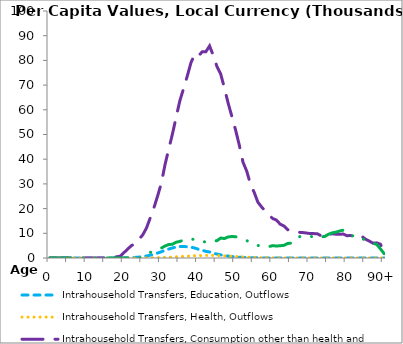
| Category | Intrahousehold Transfers, Education, Outflows | Intrahousehold Transfers, Health, Outflows | Intrahousehold Transfers, Consumption other than health and education, Outflows | Intrahousehold Transfers, Saving, Outflows |
|---|---|---|---|---|
| 0 | 0 | 0 | 0 | 0 |
|  | 0 | 0 | 0 | 0 |
| 2 | 0 | 0 | 0 | 0 |
| 3 | 0 | 0 | 0 | 0 |
| 4 | 0 | 0 | 0 | 0 |
| 5 | 0 | 0 | 0 | 0 |
| 6 | 0 | 0 | 0 | 0 |
| 7 | 0 | 0 | 0 | 0 |
| 8 | 0 | 0 | 0 | 0 |
| 9 | 0 | 0 | 0 | 0 |
| 10 | 0 | 0 | 0 | 0 |
| 11 | 0 | 0 | 0 | 0 |
| 12 | 0 | 0 | 0 | 0 |
| 13 | 0 | 0 | 0 | 0 |
| 14 | 0 | 0 | 0 | 0 |
| 15 | 0 | 0 | 0 | 0 |
| 16 | 0.366 | 0.346 | 65.875 | 0 |
| 17 | 6.569 | 1.67 | 259.832 | 0 |
| 18 | 16.383 | 2.833 | 487.914 | 0 |
| 19 | 10.416 | 3.796 | 756.479 | 0 |
| 20 | 53.145 | 10.644 | 2243.405 | 0 |
| 21 | 91.967 | 17.326 | 3692.64 | 0 |
| 22 | 187.087 | 24.302 | 5065.788 | 0 |
| 23 | 238.739 | 27.246 | 5686.196 | 0 |
| 24 | 365.379 | 36.657 | 7562.358 | 0 |
| 25 | 584.322 | 46.714 | 9346.852 | 507.666 |
| 26 | 801.056 | 62.32 | 12085.561 | 1449.732 |
| 27 | 1127.487 | 87.22 | 16141.627 | 2217.397 |
| 28 | 1541.35 | 110.231 | 20249.531 | 2931.239 |
| 29 | 2003.561 | 143.755 | 25043.103 | 3488.56 |
| 30 | 2507.913 | 181.924 | 30248.898 | 4017.642 |
| 31 | 3137.544 | 245.717 | 37759.934 | 4841.376 |
| 32 | 3620.924 | 311.477 | 44117.902 | 5451.933 |
| 33 | 4058.238 | 383.403 | 50166.623 | 5551.679 |
| 34 | 4449.046 | 469.305 | 57030.074 | 6405.236 |
| 35 | 4667.877 | 566.917 | 63673.084 | 6706.28 |
| 36 | 4631.108 | 651.606 | 68607.813 | 7281.457 |
| 37 | 4579.524 | 741.71 | 73681.284 | 7440.938 |
| 38 | 4353.614 | 845.51 | 79129.506 | 7800.765 |
| 39 | 4053.271 | 919.183 | 82488.673 | 7366.827 |
| 40 | 3511.164 | 953.761 | 81785.344 | 7367.397 |
| 41 | 3179.889 | 999.05 | 83469.096 | 6816.54 |
| 42 | 2673.718 | 1033.682 | 83512.781 | 6385.486 |
| 43 | 2440.687 | 1075.184 | 85860.055 | 6954.928 |
| 44 | 1944.502 | 1041.103 | 81952.507 | 6815.225 |
| 45 | 1583.984 | 990.184 | 77505.603 | 7032.1 |
| 46 | 1269.404 | 946.455 | 74450.504 | 8074.179 |
| 47 | 1002.368 | 867.843 | 68824.247 | 7875.927 |
| 48 | 791.258 | 777.506 | 62701.401 | 8529.473 |
| 49 | 579.719 | 693.53 | 57331.966 | 8686.921 |
| 50 | 438.14 | 610.627 | 51850.757 | 8616.211 |
| 51 | 322.562 | 511.363 | 45724.036 | 8196.906 |
| 52 | 222.982 | 409.46 | 38777.865 | 7596.645 |
| 53 | 167.153 | 342.682 | 35169.73 | 7036.466 |
| 54 | 114.312 | 264.196 | 29966.779 | 6344.574 |
| 55 | 88.1 | 210.73 | 26612.277 | 5826.137 |
| 56 | 62.167 | 159.025 | 22606.396 | 5120.941 |
| 57 | 42.625 | 126.559 | 20666.155 | 4623.427 |
| 58 | 42.046 | 98.043 | 18950.333 | 4370.855 |
| 59 | 31.418 | 75.033 | 17410.603 | 4621.211 |
| 60 | 21.006 | 58.377 | 15968.748 | 5007.75 |
| 61 | 23.753 | 47.922 | 15359.784 | 4854.06 |
| 62 | 14.141 | 36.35 | 13717.926 | 4966.854 |
| 63 | 14.356 | 26.343 | 12975.549 | 5122.813 |
| 64 | 10.79 | 17.797 | 11469.189 | 5873.644 |
| 65 | 6.197 | 12.247 | 11392.994 | 6030.873 |
| 66 | 7.812 | 13.247 | 10891.171 | 7446.895 |
| 67 | 5.656 | 10.855 | 10404.975 | 8795.833 |
| 68 | 4.057 | 8.027 | 10328.071 | 8288.632 |
| 69 | 2.252 | 5.344 | 10127.326 | 8356.417 |
| 70 | 1.478 | 5.562 | 9901.597 | 8570.653 |
| 71 | 0.88 | 5.185 | 9880.906 | 8793.036 |
| 72 | 2.073 | 3.264 | 9824.847 | 8102.786 |
| 73 | 0.174 | 1.475 | 9015.188 | 8572.81 |
| 74 | 0.07 | 2.949 | 9841.91 | 8717.952 |
| 75 | 0.29 | 0.581 | 9358.488 | 9592.716 |
| 76 | 0.165 | 0.633 | 9811.262 | 10165.385 |
| 77 | 0.2 | 0.837 | 9638.207 | 10458.416 |
| 78 | 0.347 | 1.534 | 9624.992 | 10923.296 |
| 79 | 0.087 | 1.274 | 9686.056 | 11262.753 |
| 80 | 0.491 | 1.452 | 9024.707 | 10606.337 |
| 81 | 0.002 | 0.369 | 9107.197 | 8980.496 |
| 82 | 0.005 | 0.264 | 8659.799 | 8956.547 |
| 83 | 0.001 | 0.132 | 8136.045 | 9120.636 |
| 84 | 0 | 0 | 8741.372 | 8030.443 |
| 85 | 0.003 | 0.233 | 7625.696 | 7043.986 |
| 86 | 0.005 | 0.283 | 6846.435 | 6702.674 |
| 87 | 0 | 0 | 6001.314 | 5934.521 |
| 88 | 0 | 0 | 6125.574 | 5516.247 |
| 89 | 0.001 | 0.245 | 5593.446 | 3686.393 |
| 90+ | 0.028 | 0.099 | 2263.664 | 1755.652 |